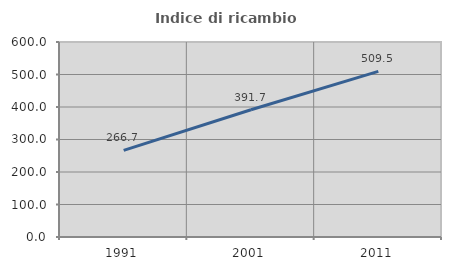
| Category | Indice di ricambio occupazionale  |
|---|---|
| 1991.0 | 266.667 |
| 2001.0 | 391.667 |
| 2011.0 | 509.524 |